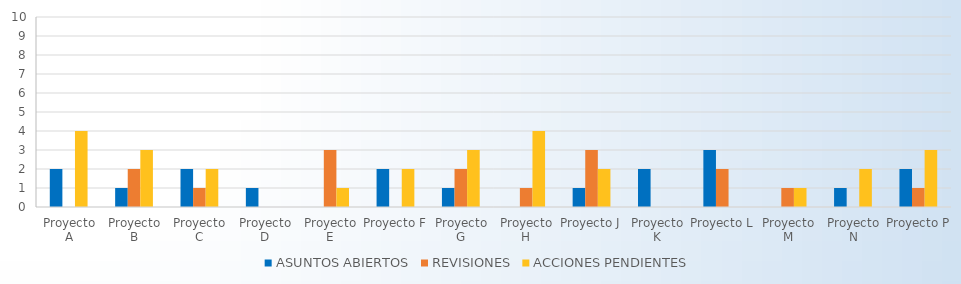
| Category | ASUNTOS ABIERTOS | REVISIONES | ACCIONES PENDIENTES |
|---|---|---|---|
| Proyecto A | 2 | 0 | 4 |
| Proyecto B | 1 | 2 | 3 |
| Proyecto C | 2 | 1 | 2 |
| Proyecto D | 1 | 0 | 0 |
| Proyecto E | 0 | 3 | 1 |
| Proyecto F | 2 | 0 | 2 |
| Proyecto G | 1 | 2 | 3 |
| Proyecto H | 0 | 1 | 4 |
| Proyecto J | 1 | 3 | 2 |
| Proyecto K | 2 | 0 | 0 |
| Proyecto L | 3 | 2 | 0 |
| Proyecto M | 0 | 1 | 1 |
| Proyecto N | 1 | 0 | 2 |
| Proyecto P | 2 | 1 | 3 |